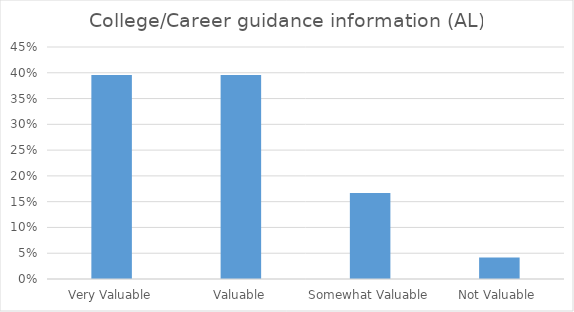
| Category | College/Career guidance information (AL) |
|---|---|
| Very Valuable | 0.396 |
| Valuable | 0.396 |
| Somewhat Valuable | 0.167 |
| Not Valuable | 0.042 |